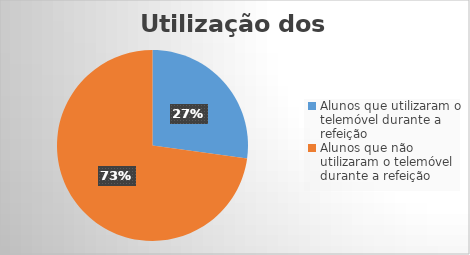
| Category | Series 5 |
|---|---|
| Alunos que utilizaram o telemóvel durante a refeição  | 25 |
| Alunos que não utilizaram o telemóvel durante a refeição  | 67 |